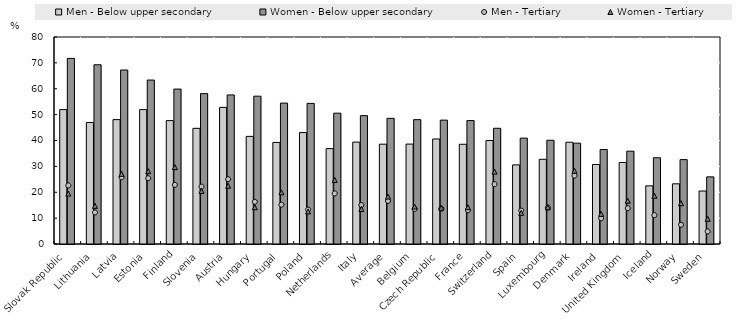
| Category | Men - Below upper secondary | Women - Below upper secondary |
|---|---|---|
| Slovak Republic | 51.951 | 71.73 |
| Lithuania | 46.941 | 69.265 |
| Latvia | 48.071 | 67.246 |
| Estonia | 51.955 | 63.362 |
| Finland | 47.691 | 59.868 |
| Slovenia | 44.7 | 58.119 |
| Austria | 52.809 | 57.617 |
| Hungary | 41.593 | 57.128 |
| Portugal | 39.249 | 54.462 |
| Poland | 43.057 | 54.351 |
| Netherlands | 36.859 | 50.557 |
| Italy | 39.382 | 49.607 |
| Average | 38.576 | 48.567 |
| Belgium | 38.614 | 48.057 |
| Czech Republic | 40.588 | 47.863 |
| France | 38.545 | 47.703 |
| Switzerland | 39.997 | 44.726 |
| Spain | 30.575 | 40.922 |
| Luxembourg | 32.73 | 40.102 |
| Denmark | 39.318 | 38.978 |
| Ireland | 30.721 | 36.5 |
| United Kingdom | 31.497 | 35.875 |
| Iceland | 22.48 | 33.339 |
| Norway | 23.255 | 32.611 |
| Sweden | 20.483 | 25.951 |